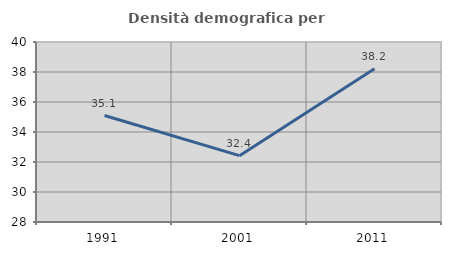
| Category | Densità demografica |
|---|---|
| 1991.0 | 35.098 |
| 2001.0 | 32.423 |
| 2011.0 | 38.209 |